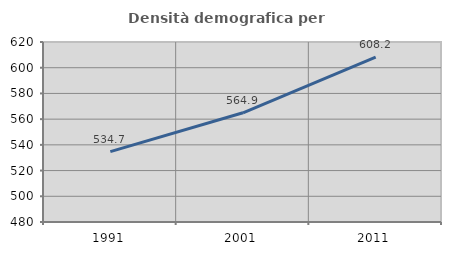
| Category | Densità demografica |
|---|---|
| 1991.0 | 534.702 |
| 2001.0 | 564.934 |
| 2011.0 | 608.205 |